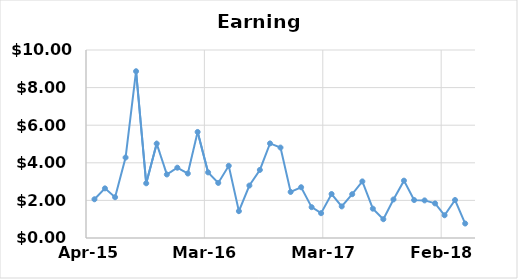
| Category | Series 0 |
|---|---|
| 42125.0 | 2.06 |
| 42156.0 | 2.64 |
| 42186.0 | 2.17 |
| 42217.0 | 4.28 |
| 42248.0 | 8.87 |
| 42278.0 | 2.91 |
| 42309.0 | 5.02 |
| 42339.0 | 3.38 |
| 42370.0 | 3.74 |
| 42401.0 | 3.43 |
| 42430.0 | 5.64 |
| 42461.0 | 3.49 |
| 42491.0 | 2.93 |
| 42522.0 | 3.84 |
| 42552.0 | 1.43 |
| 42583.0 | 2.79 |
| 42614.0 | 3.62 |
| 42644.0 | 5.03 |
| 42675.0 | 4.81 |
| 42705.0 | 2.45 |
| 42736.0 | 2.7 |
| 42767.0 | 1.64 |
| 42795.0 | 1.32 |
| 42826.0 | 2.34 |
| 42856.0 | 1.68 |
| 42887.0 | 2.33 |
| 42917.0 | 3.01 |
| 42948.0 | 1.56 |
| 42979.0 | 1 |
| 43009.0 | 2.05 |
| 43040.0 | 3.05 |
| 43070.0 | 2.02 |
| 43101.0 | 2 |
| 43132.0 | 1.84 |
| 43160.0 | 1.21 |
| 43191.0 | 2.02 |
| 43221.0 | 0.77 |